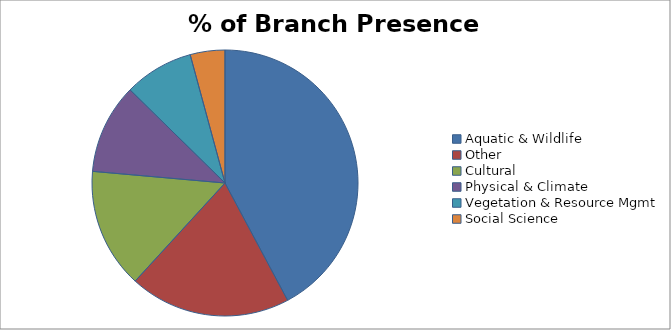
| Category | Total |
|---|---|
| Aquatic & Wildlife | 370 |
| Other | 172 |
| Cultural | 128 |
| Physical & Climate | 96 |
| Vegetation & Resource Mgmt | 74 |
| Social Science | 37 |